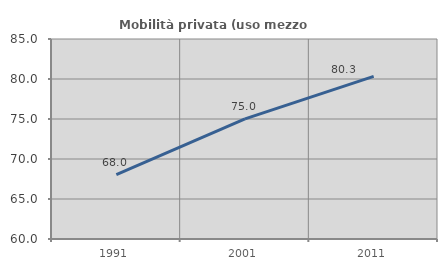
| Category | Mobilità privata (uso mezzo privato) |
|---|---|
| 1991.0 | 68.05 |
| 2001.0 | 75.017 |
| 2011.0 | 80.322 |